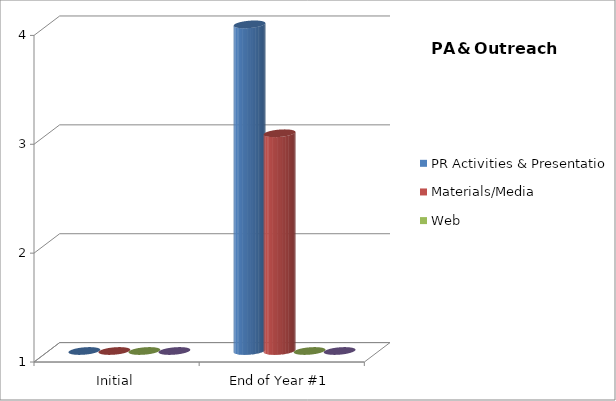
| Category | PR Activities & Presentations  | Materials/Media  | Web | Accessibility/Diversity  |
|---|---|---|---|---|
| Initial | 1 | 1 | 1 | 1 |
| End of Year #1 | 4 | 3 | 1 | 1 |